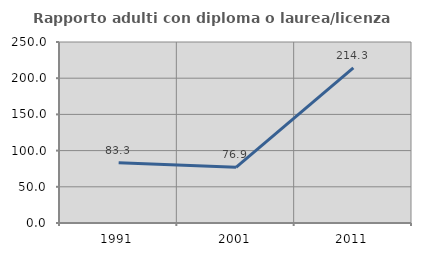
| Category | Rapporto adulti con diploma o laurea/licenza media  |
|---|---|
| 1991.0 | 83.333 |
| 2001.0 | 76.923 |
| 2011.0 | 214.286 |